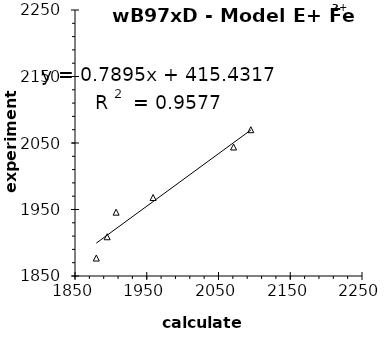
| Category | Series 0 |
|---|---|
| 1879.692204301075 | 1877 |
| 1894.818548387097 | 1909 |
| 1907.275537634408 | 1946 |
| 1958.883064516129 | 1968 |
| 2070.995967741936 | 2044 |
| 2095.020161290322 | 2070 |